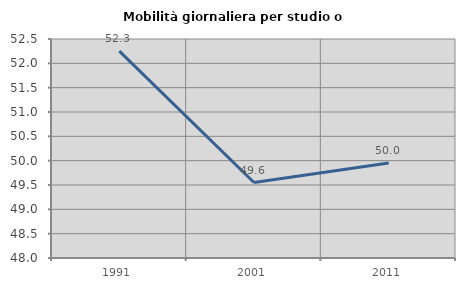
| Category | Mobilità giornaliera per studio o lavoro |
|---|---|
| 1991.0 | 52.25 |
| 2001.0 | 49.55 |
| 2011.0 | 49.953 |